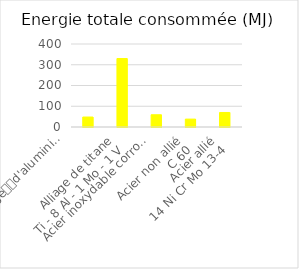
| Category | Series 0 |
|---|---|
| Alliage
d'aluminium
4032-T6
(Al Si 12,5 Mg Cu Ni) | 48 |
| Alliage de titane
Ti - 8 Al - 1 Mo - 1 V | 330 |
| Acier inoxydable corroyé
X6 Cr Ni Ti 18-10 | 59 |
| Acier non allié
C 60 | 38 |
| Acier allié
14 Ni Cr Mo 13-4 | 70 |